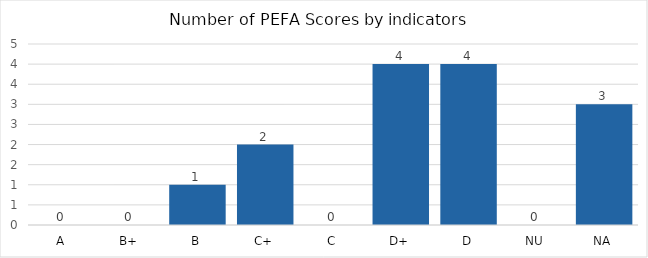
| Category |   | 2021 |
|---|---|---|
| A |  | 0 |
| B+ |  | 0 |
| B |  | 1 |
| C+ |  | 2 |
| C |  | 0 |
| D+ |  | 4 |
| D |  | 4 |
| NU |  | 0 |
| NA |  | 3 |